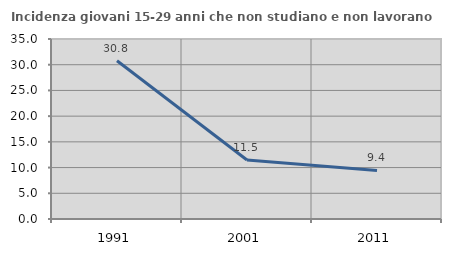
| Category | Incidenza giovani 15-29 anni che non studiano e non lavorano  |
|---|---|
| 1991.0 | 30.769 |
| 2001.0 | 11.475 |
| 2011.0 | 9.434 |